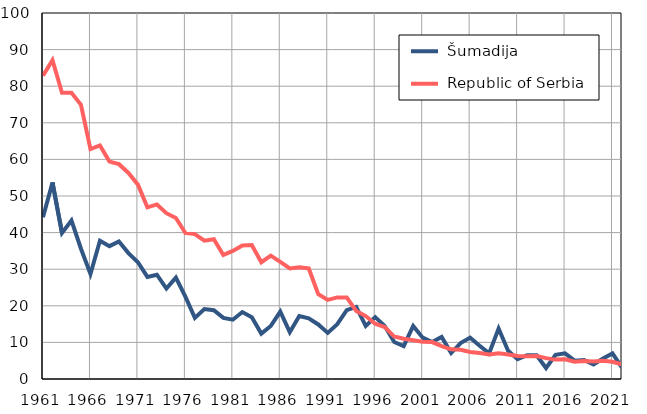
| Category |  Šumadija |  Republic of Serbia |
|---|---|---|
| 1961.0 | 44.2 | 82.9 |
| 1962.0 | 53.7 | 87.1 |
| 1963.0 | 39.9 | 78.2 |
| 1964.0 | 43.3 | 78.2 |
| 1965.0 | 35.6 | 74.9 |
| 1966.0 | 28.7 | 62.8 |
| 1967.0 | 37.8 | 63.8 |
| 1968.0 | 36.3 | 59.4 |
| 1969.0 | 37.6 | 58.7 |
| 1970.0 | 34.4 | 56.3 |
| 1971.0 | 31.9 | 53.1 |
| 1972.0 | 27.9 | 46.9 |
| 1973.0 | 28.5 | 47.7 |
| 1974.0 | 24.7 | 45.3 |
| 1975.0 | 27.7 | 44 |
| 1976.0 | 22.5 | 39.9 |
| 1977.0 | 16.7 | 39.6 |
| 1978.0 | 19.1 | 37.8 |
| 1979.0 | 18.8 | 38.2 |
| 1980.0 | 16.7 | 33.9 |
| 1981.0 | 16.2 | 35 |
| 1982.0 | 18.3 | 36.5 |
| 1983.0 | 16.9 | 36.6 |
| 1984.0 | 12.4 | 31.9 |
| 1985.0 | 14.5 | 33.7 |
| 1986.0 | 18.4 | 32 |
| 1987.0 | 12.8 | 30.2 |
| 1988.0 | 17.2 | 30.5 |
| 1989.0 | 16.6 | 30.2 |
| 1990.0 | 14.9 | 23.2 |
| 1991.0 | 12.6 | 21.6 |
| 1992.0 | 15 | 22.3 |
| 1993.0 | 18.8 | 22.3 |
| 1994.0 | 19.7 | 18.6 |
| 1995.0 | 14.5 | 17.2 |
| 1996.0 | 16.9 | 15.1 |
| 1997.0 | 14.5 | 14.2 |
| 1998.0 | 10.1 | 11.6 |
| 1999.0 | 9 | 11 |
| 2000.0 | 14.5 | 10.6 |
| 2001.0 | 11.3 | 10.2 |
| 2002.0 | 10.1 | 10.1 |
| 2003.0 | 11.5 | 9 |
| 2004.0 | 7.1 | 8.1 |
| 2005.0 | 9.8 | 8 |
| 2006.0 | 11.3 | 7.4 |
| 2007.0 | 9.1 | 7.1 |
| 2008.0 | 7 | 6.7 |
| 2009.0 | 13.8 | 7 |
| 2010.0 | 7.7 | 6.7 |
| 2011.0 | 5.4 | 6.3 |
| 2012.0 | 6.5 | 6.2 |
| 2013.0 | 6.5 | 6.3 |
| 2014.0 | 3 | 5.7 |
| 2015.0 | 6.6 | 5.3 |
| 2016.0 | 7 | 5.4 |
| 2017.0 | 5 | 4.7 |
| 2018.0 | 5.2 | 4.9 |
| 2019.0 | 4 | 4.8 |
| 2020.0 | 5.6 | 5 |
| 2021.0 | 7 | 4.7 |
| 2022.0 | 3.1 | 4 |